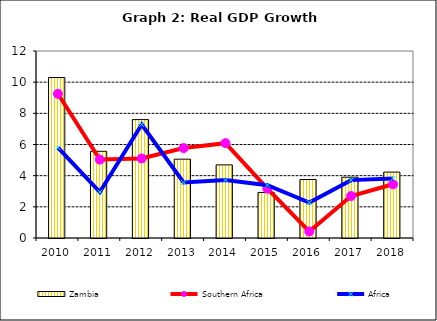
| Category | Zambia |
|---|---|
| 2010.0 | 10.298 |
| 2011.0 | 5.565 |
| 2012.0 | 7.598 |
| 2013.0 | 5.059 |
| 2014.0 | 4.692 |
| 2015.0 | 2.924 |
| 2016.0 | 3.752 |
| 2017.0 | 3.901 |
| 2018.0 | 4.23 |